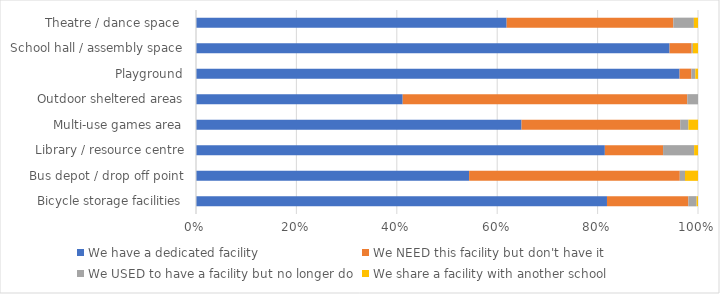
| Category | We have a dedicated facility | We NEED this facility but don't have it | We USED to have a facility but no longer do | We share a facility with another school |
|---|---|---|---|---|
| Bicycle storage facilities | 0.819 | 0.162 | 0.016 | 0.003 |
| Bus depot / drop off point | 0.544 | 0.42 | 0.01 | 0.026 |
| Library / resource centre | 0.814 | 0.116 | 0.062 | 0.008 |
| Multi-use games area | 0.649 | 0.316 | 0.016 | 0.019 |
| Outdoor sheltered areas | 0.412 | 0.567 | 0.021 | 0 |
| Playground | 0.963 | 0.024 | 0.008 | 0.005 |
| School hall / assembly space | 0.943 | 0.044 | 0.003 | 0.01 |
| Theatre / dance space  | 0.619 | 0.332 | 0.041 | 0.008 |